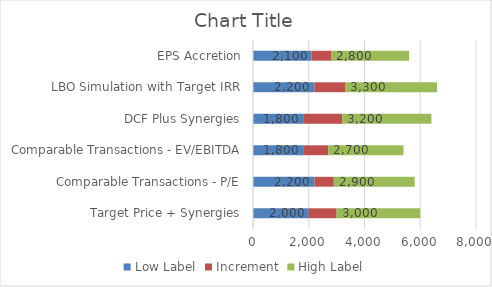
| Category | Low Label | Increment | High Label |
|---|---|---|---|
| Target Price + Synergies | 2000 | 1000 | 3000 |
| Comparable Transactions - P/E | 2200 | 700 | 2900 |
| Comparable Transactions - EV/EBITDA | 1800 | 900 | 2700 |
| DCF Plus Synergies | 1800 | 1400 | 3200 |
| LBO Simulation with Target IRR | 2200 | 1100 | 3300 |
| EPS Accretion | 2100 | 700 | 2800 |